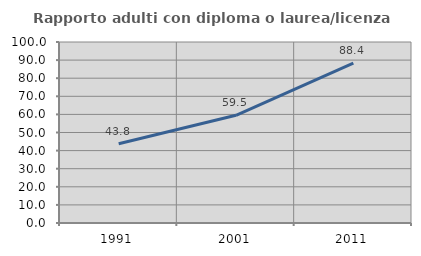
| Category | Rapporto adulti con diploma o laurea/licenza media  |
|---|---|
| 1991.0 | 43.79 |
| 2001.0 | 59.526 |
| 2011.0 | 88.367 |